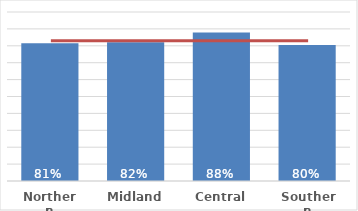
| Category | Dep 5 |
|---|---|
| Northern | 0.815 |
| Midland | 0.822 |
| Central | 0.879 |
| Southern | 0.804 |